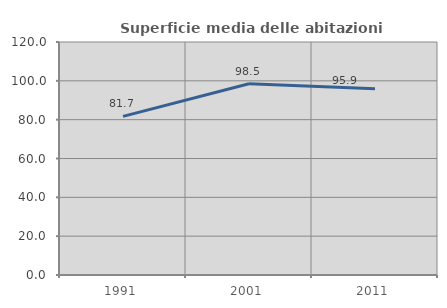
| Category | Superficie media delle abitazioni occupate |
|---|---|
| 1991.0 | 81.676 |
| 2001.0 | 98.521 |
| 2011.0 | 95.94 |